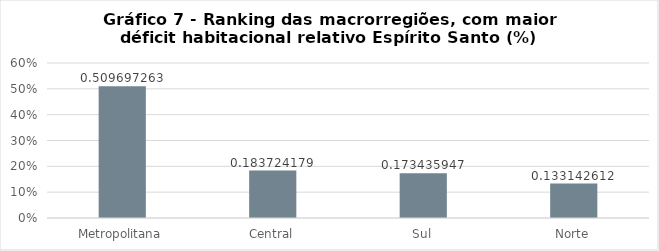
| Category | Series 0 |
|---|---|
| Metropolitana | 0.51 |
| Central | 0.184 |
| Sul | 0.173 |
| Norte | 0.133 |